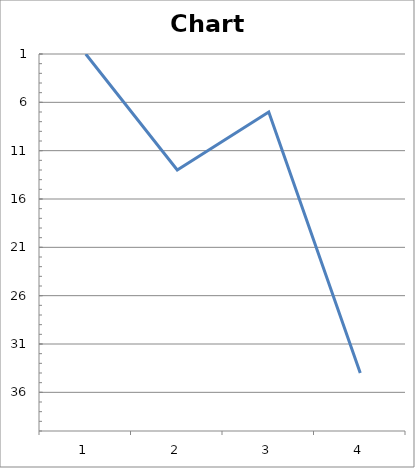
| Category | Chart Position |
|---|---|
| 1.0 | 1 |
| 2.0 | 13 |
| 3.0 | 7 |
| 4.0 | 34 |